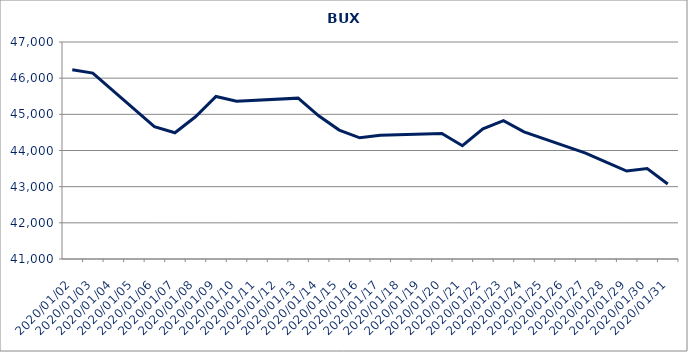
| Category | Series 0 |
|---|---|
| 2020-01-02 | 46230.218 |
| 2020-01-03 | 46141.224 |
| 2020-01-06 | 44658.759 |
| 2020-01-07 | 44490.798 |
| 2020-01-08 | 44932.181 |
| 2020-01-09 | 45493.151 |
| 2020-01-10 | 45364.138 |
| 2020-01-13 | 45447.517 |
| 2020-01-14 | 44960.314 |
| 2020-01-15 | 44565.031 |
| 2020-01-16 | 44350.395 |
| 2020-01-17 | 44422.806 |
| 2020-01-20 | 44470.931 |
| 2020-01-21 | 44132.002 |
| 2020-01-22 | 44597.049 |
| 2020-01-23 | 44823.279 |
| 2020-01-24 | 44515.972 |
| 2020-01-27 | 43929.169 |
| 2020-01-28 | 43675.499 |
| 2020-01-29 | 43431.302 |
| 2020-01-30 | 43501.994 |
| 2020-01-31 | 43072.078 |